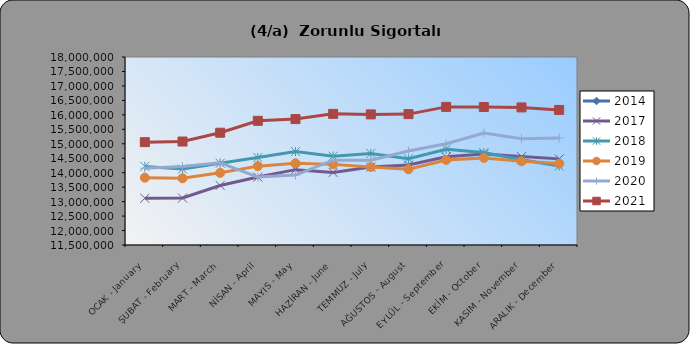
| Category | 2014 | 2017 | 2018 | 2019 | 2020 | 2021 |
|---|---|---|---|---|---|---|
| OCAK - January |  |  | 14218231 | 13826757 | 14154168 | 15055602 |
| ŞUBAT - February |  |  | 14127524 | 13807689 | 14211588 | 15077515 |
| MART - March |  |  | 14325806 | 13994899 | 14339304 | 15381821 |
| NİSAN - April |  |  | 14527332 | 14226393 | 13847835 | 15794188 |
| MAYIS - May |  |  | 14729306 | 14324472 | 13919211 | 15853614 |
| HAZİRAN - June |  |  | 14570283 | 14287607 | 14431133 | 16033979 |
| TEMMUZ - July |  |  | 14664384 | 14198097 | 14432781 | 16015524 |
| AĞUSTOS - August |  |  | 14482653 | 14119665 | 14749189 | 16025300 |
| EYLÜL - September |  |  | 14809349 | 14440956 | 14998852 | 16275150 |
| EKİM - October |  |  | 14695062 | 14511611 | 15371347 | 16270696 |
| KASIM - November |  |  | 14448590 | 14393707 | 15175670 | 16257219 |
| ARALIK - December |  |  | 14229170 | 14314313 | 15203423 | 16169679 |